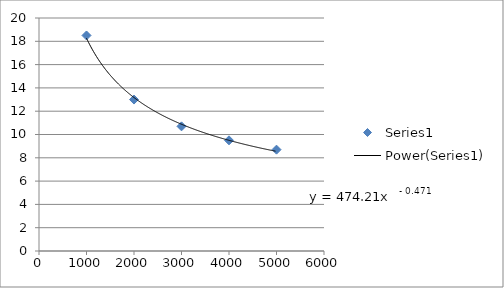
| Category | Series 0 |
|---|---|
| 1000.0 | 18.5 |
| 2000.0 | 13 |
| 3000.0 | 10.7 |
| 4000.0 | 9.5 |
| 5000.0 | 8.7 |